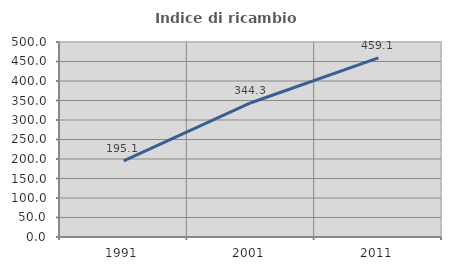
| Category | Indice di ricambio occupazionale  |
|---|---|
| 1991.0 | 195.062 |
| 2001.0 | 344.286 |
| 2011.0 | 459.091 |